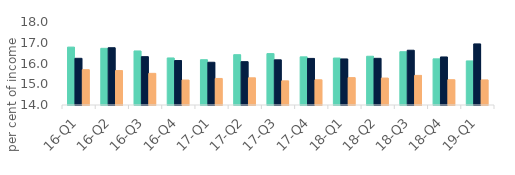
| Category | First-time
buyers | Homemovers | Homowner remortgaging |
|---|---|---|---|
| 16-Q1 | 16.791 | 16.251 | 15.702 |
| 16-Q2 | 16.731 | 16.761 | 15.66 |
| 16-Q3 | 16.604 | 16.329 | 15.525 |
| 16-Q4 | 16.267 | 16.143 | 15.203 |
| 17-Q1 | 16.183 | 16.06 | 15.279 |
| 17-Q2 | 16.425 | 16.089 | 15.31 |
| 17-Q3 | 16.477 | 16.177 | 15.163 |
| 17-Q4 | 16.32 | 16.245 | 15.215 |
| 18-Q1 | 16.263 | 16.22 | 15.32 |
| 18-Q2 | 16.349 | 16.25 | 15.298 |
| 18-Q3 | 16.568 | 16.639 | 15.426 |
| 18-Q4 | 16.224 | 16.316 | 15.219 |
| 19-Q1 | 16.124 | 16.944 | 15.209 |